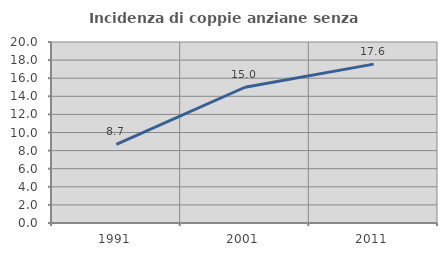
| Category | Incidenza di coppie anziane senza figli  |
|---|---|
| 1991.0 | 8.696 |
| 2001.0 | 15 |
| 2011.0 | 17.557 |